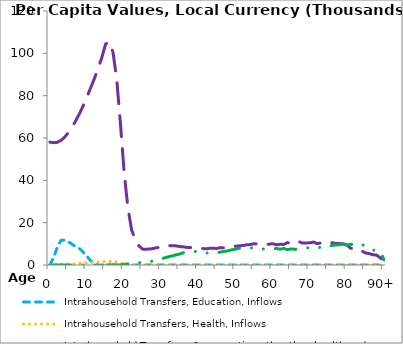
| Category | Intrahousehold Transfers, Education, Inflows | Intrahousehold Transfers, Health, Inflows | Intrahousehold Transfers, Consumption other than health and education, Inflows | Intrahousehold Transfers, Saving, Inflows |
|---|---|---|---|---|
| 0 | 0 | 215.516 | 58059.673 | 0 |
|  | 3579.123 | 280.262 | 57780.515 | 0 |
| 2 | 8335.665 | 332.723 | 57951.234 | 0 |
| 3 | 11640.09 | 373.191 | 58827.883 | 0 |
| 4 | 11805.67 | 418.428 | 60431.08 | 0 |
| 5 | 10970.5 | 481.223 | 62585.914 | 0 |
| 6 | 9817.445 | 565.582 | 65195.347 | 0 |
| 7 | 8557.839 | 667.342 | 68211.83 | 0 |
| 8 | 7706.562 | 778.625 | 71595.94 | 0 |
| 9 | 6004.286 | 894.838 | 75360.99 | 0 |
| 10 | 4105.937 | 1013.737 | 79425.47 | 0 |
| 11 | 1972.54 | 1136.311 | 83750.76 | 0 |
| 12 | 814.591 | 1263.377 | 88161.02 | 0 |
| 13 | 34.141 | 1396.652 | 92838.89 | 0 |
| 14 | 16.421 | 1536.207 | 98051.94 | 0 |
| 15 | 30.492 | 1684.212 | 104370.11 | 0 |
| 16 | 0 | 1718.002 | 105408.47 | 11.209 |
| 17 | 0 | 1617.838 | 100523.1 | 11.182 |
| 18 | 2.676 | 1362.974 | 87772.38 | 14.67 |
| 19 | 7.946 | 981.779 | 66853.34 | 54.714 |
| 20 | 8.278 | 590.86 | 43852.84 | 270.984 |
| 21 | 6.41 | 313.132 | 27096.76 | 537.754 |
| 22 | 3.976 | 142.998 | 16630.049 | 889.879 |
| 23 | 2.565 | 71.269 | 12023.155 | 996.959 |
| 24 | 0.992 | 22.187 | 8944.185 | 1156.896 |
| 25 | 0 | 0 | 7487.678 | 1150.604 |
| 26 | 0 | 0 | 7478.623 | 1247.864 |
| 27 | 0 | 0 | 7539.811 | 1639.057 |
| 28 | 0 | 0 | 7876.209 | 1903.661 |
| 29 | 0 | 0 | 8227.359 | 2198.601 |
| 30 | 0 | 0 | 8567.87 | 2848.083 |
| 31 | 0 | 0 | 9117.473 | 3444.589 |
| 32 | 0 | 0 | 9149.671 | 3898.329 |
| 33 | 0 | 0 | 9083.004 | 4295.871 |
| 34 | 0 | 0 | 9024.816 | 4823.389 |
| 35 | 0 | 0 | 8726.651 | 5206.814 |
| 36 | 0 | 0 | 8564.897 | 5807.297 |
| 37 | 0 | 0 | 8289.747 | 6057.06 |
| 38 | 0 | 0 | 8220.447 | 6193.978 |
| 39 | 0 | 0 | 7948.079 | 6491.335 |
| 40 | 0 | 0 | 7859.913 | 5837.275 |
| 41 | 0 | 0 | 7779.945 | 5986.74 |
| 42 | 0 | 0 | 7653.782 | 5663.377 |
| 43 | 0 | 0 | 7862.695 | 5788.257 |
| 44 | 0 | 0 | 7887.763 | 5797.541 |
| 45 | 0 | 0 | 7811.918 | 5737.423 |
| 46 | 0 | 0 | 8225.049 | 6176.764 |
| 47 | 0 | 0 | 8052.313 | 6432.801 |
| 48 | 0 | 0 | 8475.673 | 6746.958 |
| 49 | 0 | 0 | 8682.728 | 7205.286 |
| 50 | 0 | 0 | 8881.106 | 7500.854 |
| 51 | 0 | 0 | 9060.262 | 7961.006 |
| 52 | 0 | 0 | 9199.259 | 7715.7 |
| 53 | 0 | 0 | 9533.56 | 8164.23 |
| 54 | 0 | 0 | 9665.543 | 8026.236 |
| 55 | 0 | 0 | 10070.39 | 8201.817 |
| 56 | 0 | 0 | 9849.431 | 7820.078 |
| 57 | 0 | 0 | 9810.323 | 7573.45 |
| 58 | 0 | 0 | 9827.688 | 7513.402 |
| 59 | 0 | 0 | 9828.676 | 7583.549 |
| 60 | 0 | 0 | 10074.95 | 7667.654 |
| 61 | 0 | 0 | 9528.482 | 7784.699 |
| 62 | 0 | 0 | 9797.15 | 7479.936 |
| 63 | 0 | 0 | 9714.884 | 7820.831 |
| 64 | 0 | 0 | 10607.6 | 7222.887 |
| 65 | 0 | 0 | 10062.86 | 7616.446 |
| 66 | 0 | 0 | 10724.99 | 7371.769 |
| 67 | 0 | 0 | 11074.38 | 7534.92 |
| 68 | 0 | 0 | 10340.72 | 7769.011 |
| 69 | 0 | 0 | 10410.26 | 8155.594 |
| 70 | 0 | 0 | 10479.88 | 8119.889 |
| 71 | 0 | 0 | 10851.97 | 8234.481 |
| 72 | 0 | 0 | 10086.45 | 8498.058 |
| 73 | 0 | 0 | 10439.75 | 8192.554 |
| 74 | 0 | 0 | 10168.25 | 8860.614 |
| 75 | 0 | 0 | 10602.08 | 8608.926 |
| 76 | 0 | 0 | 10504.78 | 9265.281 |
| 77 | 0 | 0 | 10185.02 | 9470.265 |
| 78 | 0 | 0 | 10126.2 | 9581.99 |
| 79 | 0 | 0 | 9992.602 | 9899.064 |
| 80 | 0 | 0 | 9426.054 | 9352.908 |
| 81 | 0 | 0 | 7922.962 | 9816.635 |
| 82 | 0 | 0 | 7723.291 | 9387.146 |
| 83 | 0 | 0 | 7629.745 | 9077.717 |
| 84 | 0 | 0 | 6568.043 | 9757.778 |
| 85 | 0 | 0 | 5690.169 | 8757.205 |
| 86 | 0 | 0 | 5380.037 | 7797.227 |
| 87 | 0 | 0 | 4831.527 | 6963.542 |
| 88 | 0 | 0 | 4661.688 | 7097.445 |
| 89 | 0 | 0 | 3275.459 | 6274.653 |
| 90+ | 0 | 0 | 2184.888 | 2382.705 |